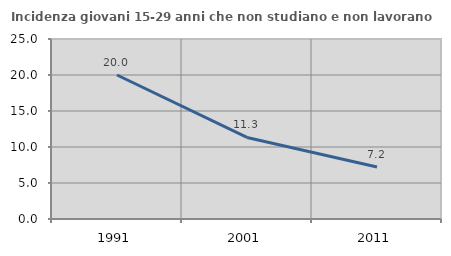
| Category | Incidenza giovani 15-29 anni che non studiano e non lavorano  |
|---|---|
| 1991.0 | 20 |
| 2001.0 | 11.331 |
| 2011.0 | 7.216 |